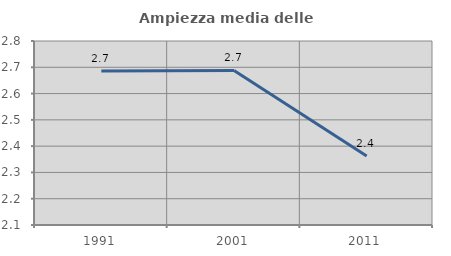
| Category | Ampiezza media delle famiglie |
|---|---|
| 1991.0 | 2.686 |
| 2001.0 | 2.688 |
| 2011.0 | 2.362 |